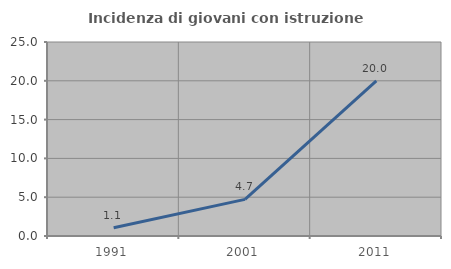
| Category | Incidenza di giovani con istruzione universitaria |
|---|---|
| 1991.0 | 1.053 |
| 2001.0 | 4.717 |
| 2011.0 | 20 |